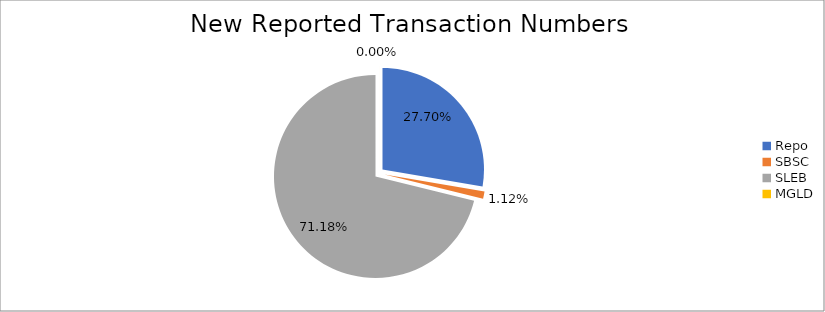
| Category | Series 0 |
|---|---|
| Repo | 286042 |
| SBSC | 11609 |
| SLEB | 735076 |
| MGLD | 19 |